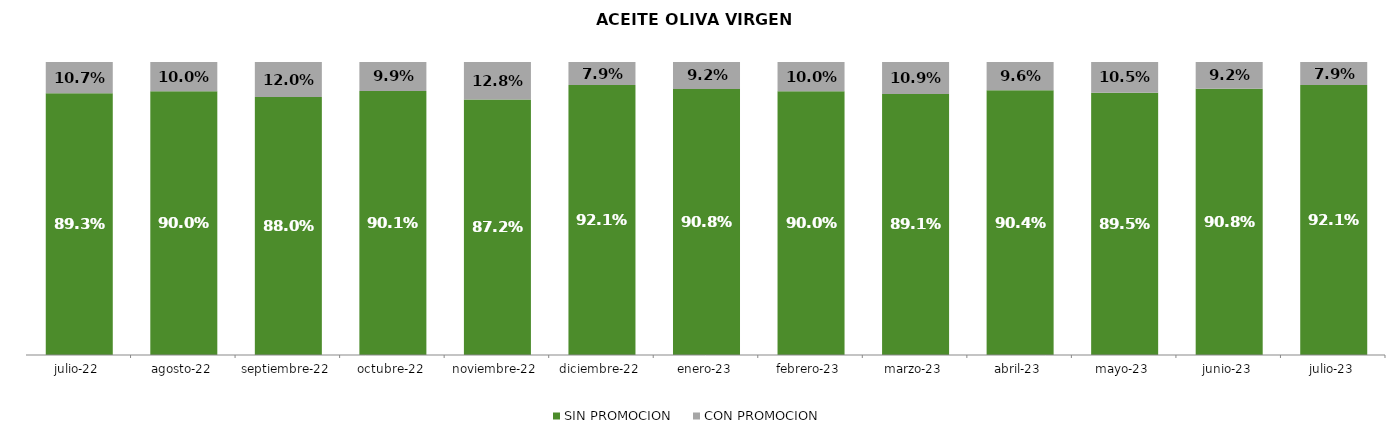
| Category | SIN PROMOCION   | CON PROMOCION   |
|---|---|---|
| 2022-07-01 | 0.893 | 0.107 |
| 2022-08-01 | 0.9 | 0.1 |
| 2022-09-01 | 0.88 | 0.12 |
| 2022-10-01 | 0.901 | 0.099 |
| 2022-11-01 | 0.872 | 0.128 |
| 2022-12-01 | 0.921 | 0.079 |
| 2023-01-01 | 0.908 | 0.092 |
| 2023-02-01 | 0.9 | 0.1 |
| 2023-03-01 | 0.891 | 0.109 |
| 2023-04-01 | 0.904 | 0.096 |
| 2023-05-01 | 0.895 | 0.105 |
| 2023-06-01 | 0.908 | 0.092 |
| 2023-07-01 | 0.921 | 0.079 |